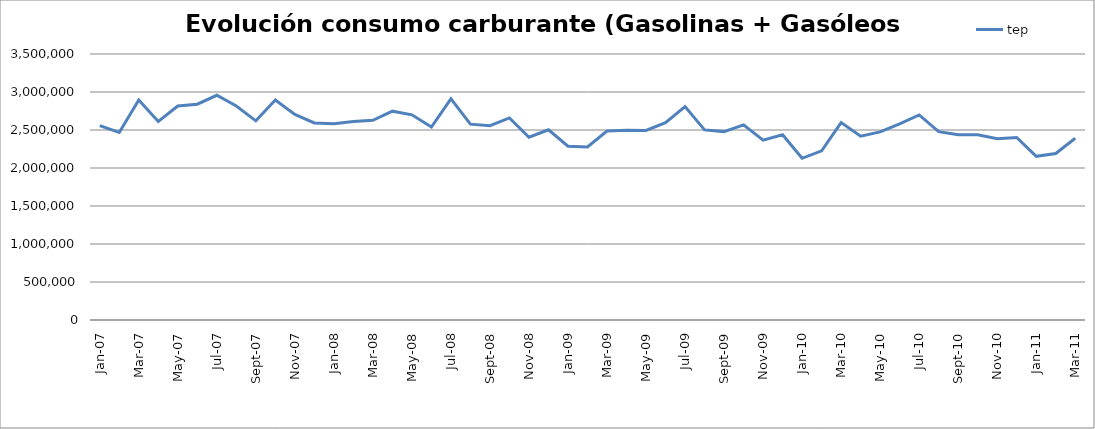
| Category | tep |
|---|---|
| 2007-01-31 | 2556527.42 |
| 2007-02-28 | 2468264.65 |
| 2007-03-31 | 2893745.26 |
| 2007-04-30 | 2612776.48 |
| 2007-05-31 | 2815520.47 |
| 2007-06-30 | 2839524.26 |
| 2007-07-31 | 2956699.71 |
| 2007-08-31 | 2816505.27 |
| 2007-09-30 | 2620531.55 |
| 2007-10-31 | 2895615.43 |
| 2007-11-30 | 2705993.18 |
| 2007-12-31 | 2593189.77 |
| 2008-01-31 | 2583845.95 |
| 2008-02-29 | 2610597.15 |
| 2008-03-31 | 2628452.95 |
| 2008-04-30 | 2747887.68 |
| 2008-05-31 | 2700008.16 |
| 2008-06-30 | 2539494.54 |
| 2008-07-31 | 2909202.06 |
| 2008-08-31 | 2576969.81 |
| 2008-09-30 | 2557536.67 |
| 2008-10-31 | 2658837.02 |
| 2008-11-30 | 2405325.18 |
| 2008-12-31 | 2503019.09 |
| 2009-01-31 | 2286709.48 |
| 2009-02-28 | 2277422.74 |
| 2009-03-31 | 2486210.36 |
| 2009-04-30 | 2498018.07 |
| 2009-05-31 | 2493621.12 |
| 2009-06-30 | 2596696.46 |
| 2009-07-31 | 2809206.71 |
| 2009-08-31 | 2501528.96 |
| 2009-09-30 | 2478748.26 |
| 2009-10-31 | 2566710.56 |
| 2009-11-30 | 2365480.04 |
| 2009-12-31 | 2437294.27 |
| 2010-01-31 | 2127563.6 |
| 2010-02-28 | 2226256.15 |
| 2010-03-31 | 2597312.39 |
| 2010-04-30 | 2417819.19 |
| 2010-05-31 | 2474602.22 |
| 2010-06-30 | 2579533.88 |
| 2010-07-31 | 2698530.99 |
| 2010-08-31 | 2478052.87 |
| 2010-09-30 | 2436801.32 |
| 2010-10-31 | 2438283.65 |
| 2010-11-30 | 2386514.95 |
| 2010-12-31 | 2402332.98 |
| 2011-01-31 | 2153887.05 |
| 2011-02-28 | 2190502.23 |
| 2011-03-31 | 2392000 |